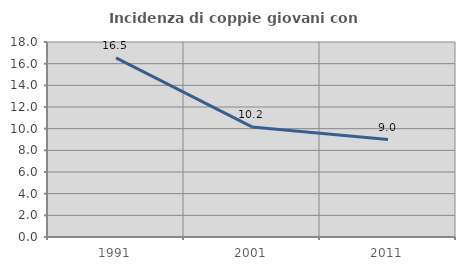
| Category | Incidenza di coppie giovani con figli |
|---|---|
| 1991.0 | 16.535 |
| 2001.0 | 10.163 |
| 2011.0 | 8.995 |